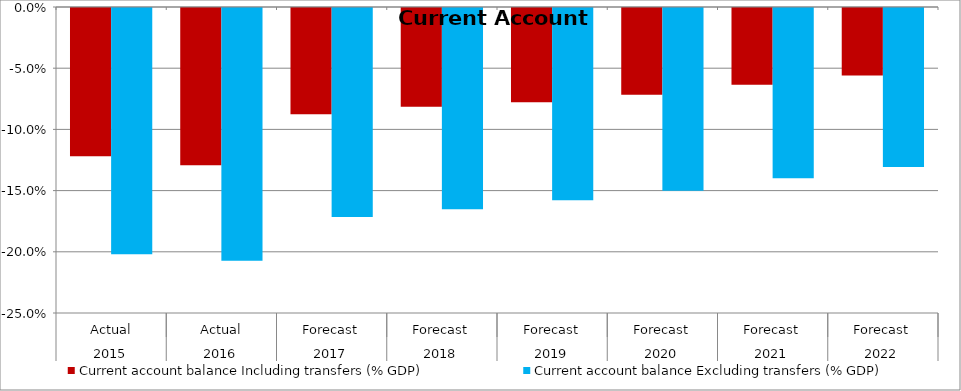
| Category | Current account balance Including transfers (% GDP) | Current account balance Excluding transfers (% GDP) |
|---|---|---|
| 0 | -0.121 | -0.201 |
| 1 | -0.128 | -0.207 |
| 2 | -0.087 | -0.171 |
| 3 | -0.081 | -0.164 |
| 4 | -0.077 | -0.157 |
| 5 | -0.071 | -0.149 |
| 6 | -0.063 | -0.139 |
| 7 | -0.055 | -0.13 |